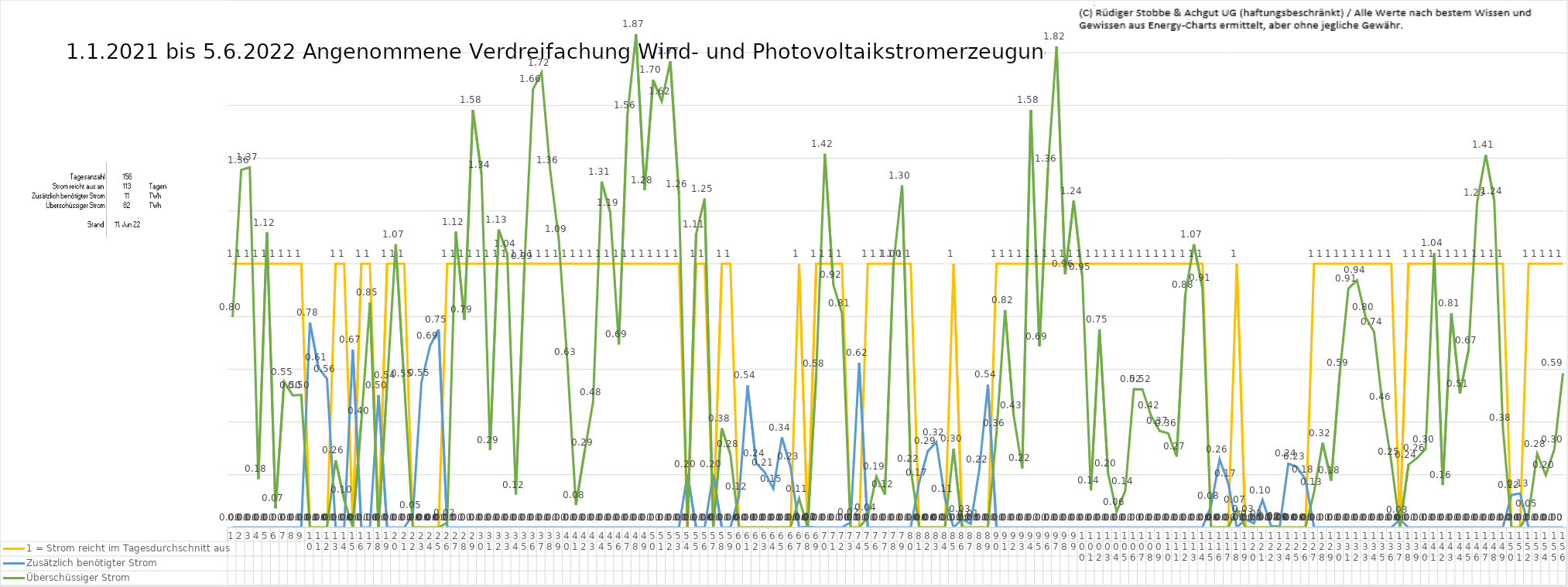
| Category | 1 = Strom reicht im Tagesdurchschnitt aus | Zusätzlich benötigter Strom | Überschüssiger Strom |
|---|---|---|---|
| 0 | 1 | 0 | 0.798 |
| 1 | 1 | 0 | 1.356 |
| 2 | 1 | 0 | 1.366 |
| 3 | 1 | 0 | 0.184 |
| 4 | 1 | 0 | 1.118 |
| 5 | 1 | 0 | 0.073 |
| 6 | 1 | 0 | 0.553 |
| 7 | 1 | 0 | 0.501 |
| 8 | 1 | 0 | 0.503 |
| 9 | 0 | 0.777 | 0 |
| 10 | 0 | 0.606 | 0 |
| 11 | 0 | 0.563 | 0 |
| 12 | 1 | 0 | 0.255 |
| 13 | 1 | 0 | 0.104 |
| 14 | 0 | 0.673 | 0 |
| 15 | 1 | 0 | 0.405 |
| 16 | 1 | 0 | 0.852 |
| 17 | 0 | 0.502 | 0 |
| 18 | 1 | 0 | 0.54 |
| 19 | 1 | 0 | 1.074 |
| 20 | 1 | 0 | 0.546 |
| 21 | 0 | 0.048 | 0 |
| 22 | 0 | 0.55 | 0 |
| 23 | 0 | 0.688 | 0 |
| 24 | 0 | 0.751 | 0 |
| 25 | 1 | 0 | 0.018 |
| 26 | 1 | 0 | 1.121 |
| 27 | 1 | 0 | 0.788 |
| 28 | 1 | 0 | 1.583 |
| 29 | 1 | 0 | 1.338 |
| 30 | 1 | 0 | 0.293 |
| 31 | 1 | 0 | 1.13 |
| 32 | 1 | 0 | 1.037 |
| 33 | 1 | 0 | 0.123 |
| 34 | 1 | 0 | 0.992 |
| 35 | 1 | 0 | 1.662 |
| 36 | 1 | 0 | 1.724 |
| 37 | 1 | 0 | 1.355 |
| 38 | 1 | 0 | 1.094 |
| 39 | 1 | 0 | 0.628 |
| 40 | 1 | 0 | 0.085 |
| 41 | 1 | 0 | 0.286 |
| 42 | 1 | 0 | 0.476 |
| 43 | 1 | 0 | 1.311 |
| 44 | 1 | 0 | 1.194 |
| 45 | 1 | 0 | 0.694 |
| 46 | 1 | 0 | 1.563 |
| 47 | 1 | 0 | 1.87 |
| 48 | 1 | 0 | 1.28 |
| 49 | 1 | 0 | 1.697 |
| 50 | 1 | 0 | 1.616 |
| 51 | 1 | 0 | 1.767 |
| 52 | 1 | 0 | 1.264 |
| 53 | 0 | 0.202 | 0 |
| 54 | 1 | 0 | 1.112 |
| 55 | 1 | 0 | 1.247 |
| 56 | 0 | 0.202 | 0 |
| 57 | 1 | 0 | 0.376 |
| 58 | 1 | 0 | 0.278 |
| 59 | 0 | 0.118 | 0 |
| 60 | 0 | 0.538 | 0 |
| 61 | 0 | 0.244 | 0 |
| 62 | 0 | 0.209 | 0 |
| 63 | 0 | 0.147 | 0 |
| 64 | 0 | 0.341 | 0 |
| 65 | 0 | 0.231 | 0 |
| 66 | 1 | 0 | 0.11 |
| 67 | 0 | 0.003 | 0 |
| 68 | 1 | 0 | 0.584 |
| 69 | 1 | 0 | 1.417 |
| 70 | 1 | 0 | 0.92 |
| 71 | 1 | 0 | 0.813 |
| 72 | 0 | 0.019 | 0 |
| 73 | 0 | 0.624 | 0 |
| 74 | 1 | 0 | 0.038 |
| 75 | 1 | 0 | 0.193 |
| 76 | 1 | 0 | 0.125 |
| 77 | 1 | 0 | 0.999 |
| 78 | 1 | 0 | 1.297 |
| 79 | 1 | 0 | 0.224 |
| 80 | 0 | 0.171 | 0 |
| 81 | 0 | 0.289 | 0 |
| 82 | 0 | 0.323 | 0 |
| 83 | 0 | 0.11 | 0 |
| 84 | 1 | 0 | 0.298 |
| 85 | 0 | 0.032 | 0 |
| 86 | 0 | 0.013 | 0 |
| 87 | 0 | 0.22 | 0 |
| 88 | 0 | 0.541 | 0 |
| 89 | 1 | 0 | 0.357 |
| 90 | 1 | 0 | 0.825 |
| 91 | 1 | 0 | 0.425 |
| 92 | 1 | 0 | 0.225 |
| 93 | 1 | 0 | 1.583 |
| 94 | 1 | 0 | 0.686 |
| 95 | 1 | 0 | 1.361 |
| 96 | 1 | 0 | 1.824 |
| 97 | 1 | 0 | 0.96 |
| 98 | 1 | 0 | 1.239 |
| 99 | 1 | 0 | 0.951 |
| 100 | 1 | 0 | 0.14 |
| 101 | 1 | 0 | 0.751 |
| 102 | 1 | 0 | 0.205 |
| 103 | 1 | 0 | 0.06 |
| 104 | 1 | 0 | 0.138 |
| 105 | 1 | 0 | 0.525 |
| 106 | 1 | 0 | 0.524 |
| 107 | 1 | 0 | 0.425 |
| 108 | 1 | 0 | 0.366 |
| 109 | 1 | 0 | 0.357 |
| 110 | 1 | 0 | 0.269 |
| 111 | 1 | 0 | 0.884 |
| 112 | 1 | 0 | 1.074 |
| 113 | 1 | 0 | 0.908 |
| 114 | 0 | 0.082 | 0 |
| 115 | 0 | 0.258 | 0 |
| 116 | 0 | 0.168 | 0 |
| 117 | 1 | 0 | 0.068 |
| 118 | 0 | 0.031 | 0 |
| 119 | 0 | 0.016 | 0 |
| 120 | 0 | 0.104 | 0 |
| 121 | 0 | 0.005 | 0 |
| 122 | 0 | 0.003 | 0 |
| 123 | 0 | 0.242 | 0 |
| 124 | 0 | 0.23 | 0 |
| 125 | 0 | 0.181 | 0 |
| 126 | 1 | 0 | 0.134 |
| 127 | 1 | 0 | 0.321 |
| 128 | 1 | 0 | 0.178 |
| 129 | 1 | 0 | 0.585 |
| 130 | 1 | 0 | 0.906 |
| 131 | 1 | 0 | 0.937 |
| 132 | 1 | 0 | 0.798 |
| 133 | 1 | 0 | 0.741 |
| 134 | 1 | 0 | 0.458 |
| 135 | 1 | 0 | 0.25 |
| 136 | 0 | 0.03 | 0 |
| 137 | 1 | 0 | 0.238 |
| 138 | 1 | 0 | 0.263 |
| 139 | 1 | 0 | 0.298 |
| 140 | 1 | 0 | 1.04 |
| 141 | 1 | 0 | 0.161 |
| 142 | 1 | 0 | 0.812 |
| 143 | 1 | 0 | 0.509 |
| 144 | 1 | 0 | 0.672 |
| 145 | 1 | 0 | 1.232 |
| 146 | 1 | 0 | 1.413 |
| 147 | 1 | 0 | 1.238 |
| 148 | 1 | 0 | 0.379 |
| 149 | 0 | 0.123 | 0 |
| 150 | 0 | 0.129 | 0 |
| 151 | 1 | 0 | 0.052 |
| 152 | 1 | 0 | 0.279 |
| 153 | 1 | 0 | 0.199 |
| 154 | 1 | 0 | 0.296 |
| 155 | 1 | 0 | 0.585 |